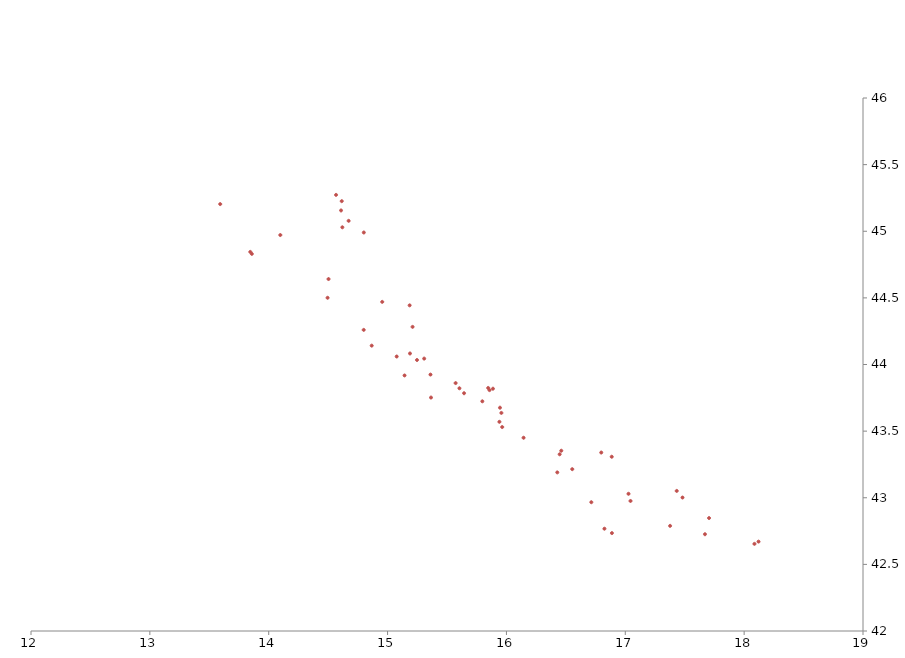
| Category | PAH Croatia |
|---|---|
| 13.591979 | 45.204 |
| 13.845192 | 44.845 |
| 13.857928 | 44.83 |
| 14.097678 | 44.972 |
| 14.566458 | 45.273 |
| 14.614357 | 45.226 |
| 14.608581 | 45.156 |
| 14.672386 | 45.078 |
| 14.80013 | 44.991 |
| 14.619498 | 45.03 |
| 14.503273 | 44.641 |
| 14.495218 | 44.501 |
| 14.955109 | 44.47 |
| 15.18564 | 44.444 |
| 15.210407 | 44.282 |
| 14.79917 | 44.26 |
| 14.866483 | 44.142 |
| 15.188513 | 44.083 |
| 15.24751 | 44.034 |
| 15.076808 | 44.06 |
| 15.142861 | 43.918 |
| 15.360994 | 43.924 |
| 15.307966 | 44.044 |
| 15.365405 | 43.752 |
| 15.572466 | 43.861 |
| 15.60459 | 43.822 |
| 15.64349 | 43.784 |
| 15.857736 | 43.808 |
| 15.846667 | 43.824 |
| 15.886719 | 43.818 |
| 15.797362 | 43.724 |
| 15.945718 | 43.676 |
| 15.957561 | 43.637 |
| 15.940943 | 43.57 |
| 15.964579 | 43.531 |
| 16.144206 | 43.45 |
| 16.797672 | 43.339 |
| 16.885881 | 43.308 |
| 16.447885 | 43.326 |
| 16.461513 | 43.353 |
| 16.427861 | 43.19 |
| 16.553908 | 43.215 |
| 17.432728 | 43.051 |
| 17.481396 | 43.002 |
| 17.704852 | 42.848 |
| 17.027106 | 43.03 |
| 16.71424 | 42.966 |
| 17.043988 | 42.976 |
| 16.887478 | 42.735 |
| 16.824639 | 42.768 |
| 17.377104 | 42.789 |
| 17.670375 | 42.726 |
| 18.121156 | 42.671 |
| 18.086801 | 42.654 |